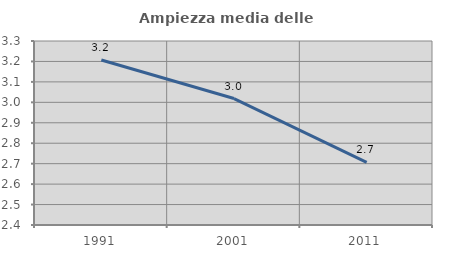
| Category | Ampiezza media delle famiglie |
|---|---|
| 1991.0 | 3.207 |
| 2001.0 | 3.018 |
| 2011.0 | 2.707 |